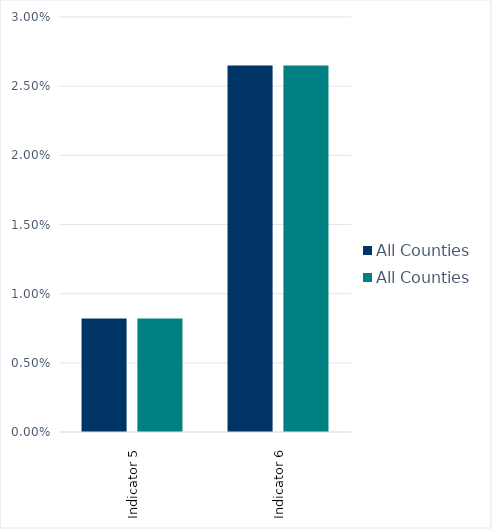
| Category | All Counties |
|---|---|
| Indicator 5 | 0.008 |
| Indicator 6 | 0.026 |